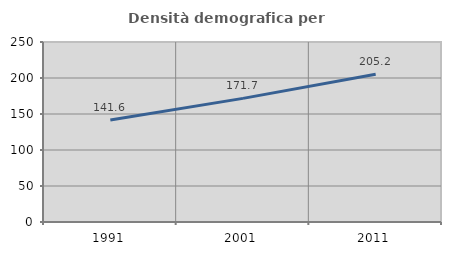
| Category | Densità demografica |
|---|---|
| 1991.0 | 141.612 |
| 2001.0 | 171.676 |
| 2011.0 | 205.218 |